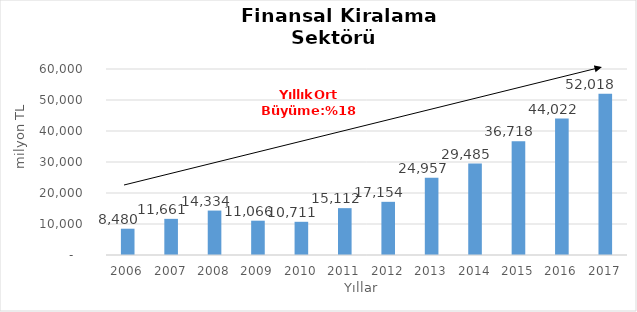
| Category | Finansal Kiralama  |
|---|---|
| 2006.0 | 8479.947 |
| 2007.0 | 11660.58 |
| 2008.0 | 14333.808 |
| 2009.0 | 11065.67 |
| 2010.0 | 10710.722 |
| 2011.0 | 15112.153 |
| 2012.0 | 17154.47 |
| 2013.0 | 24957.48 |
| 2014.0 | 29485.282 |
| 2015.0 | 36718 |
| 2016.0 | 44022 |
| 2017.0 | 52018 |